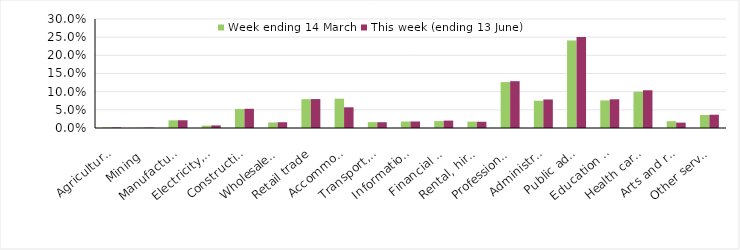
| Category | Week ending 14 March | This week (ending 13 June) |
|---|---|---|
| Agriculture, forestry and fishing | 0.002 | 0.002 |
| Mining | 0.001 | 0.001 |
| Manufacturing | 0.021 | 0.021 |
| Electricity, gas, water and waste services | 0.006 | 0.007 |
| Construction | 0.052 | 0.053 |
| Wholesale trade | 0.015 | 0.016 |
| Retail trade | 0.079 | 0.08 |
| Accommodation and food services | 0.081 | 0.057 |
| Transport, postal and warehousing | 0.016 | 0.016 |
| Information media and telecommunications | 0.018 | 0.018 |
| Financial and insurance services | 0.019 | 0.02 |
| Rental, hiring and real estate services | 0.018 | 0.017 |
| Professional, scientific and technical services | 0.126 | 0.129 |
| Administrative and support services | 0.075 | 0.079 |
| Public administration and safety | 0.241 | 0.251 |
| Education and training | 0.076 | 0.079 |
| Health care and social assistance | 0.1 | 0.104 |
| Arts and recreation services | 0.019 | 0.015 |
| Other services | 0.036 | 0.037 |